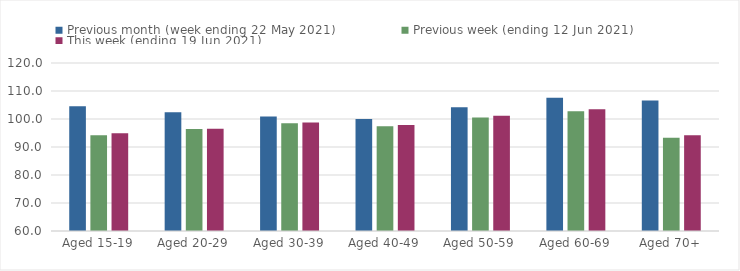
| Category | Previous month (week ending 22 May 2021) | Previous week (ending 12 Jun 2021) | This week (ending 19 Jun 2021) |
|---|---|---|---|
| Aged 15-19 | 104.58 | 94.16 | 94.93 |
| Aged 20-29 | 102.4 | 96.39 | 96.53 |
| Aged 30-39 | 100.89 | 98.52 | 98.73 |
| Aged 40-49 | 100.03 | 97.38 | 97.85 |
| Aged 50-59 | 104.17 | 100.58 | 101.13 |
| Aged 60-69 | 107.56 | 102.74 | 103.49 |
| Aged 70+ | 106.63 | 93.28 | 94.18 |